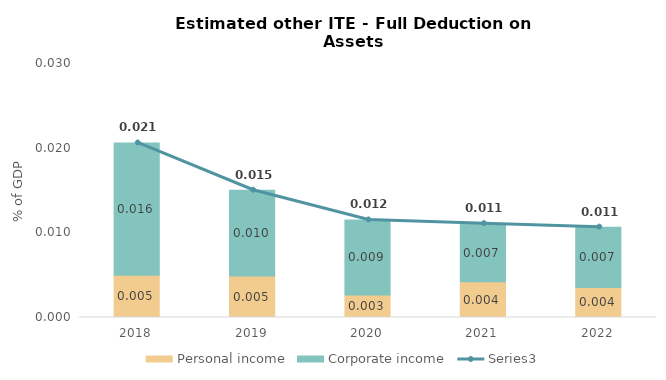
| Category | Personal income | Corporate income |
|---|---|---|
| 2018.0 | 0.005 | 0.016 |
| 2019.0 | 0.005 | 0.01 |
| 2020.0 | 0.003 | 0.009 |
| 2021.0 | 0.004 | 0.007 |
| 2022.0 | 0.004 | 0.007 |